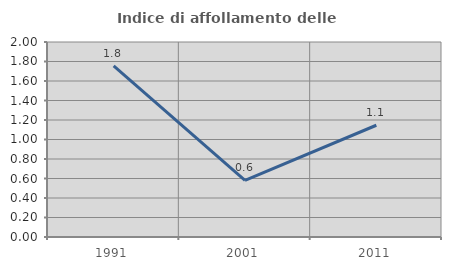
| Category | Indice di affollamento delle abitazioni  |
|---|---|
| 1991.0 | 1.754 |
| 2001.0 | 0.581 |
| 2011.0 | 1.146 |